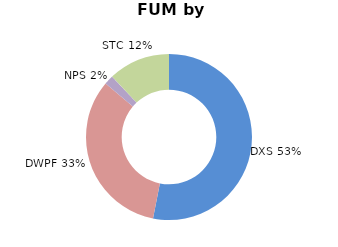
| Category | Series 0 |
|---|---|
| DXS | 0.531 |
| DWPF | 0.331 |
| NPS | 0.018 |
| STC | 0.12 |